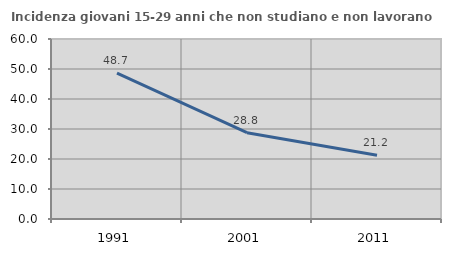
| Category | Incidenza giovani 15-29 anni che non studiano e non lavorano  |
|---|---|
| 1991.0 | 48.662 |
| 2001.0 | 28.774 |
| 2011.0 | 21.233 |